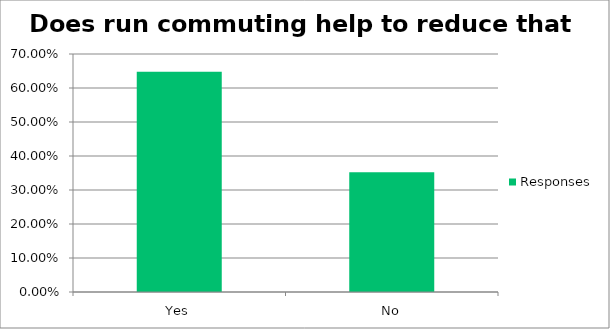
| Category | Responses |
|---|---|
| Yes | 0.648 |
| No | 0.352 |